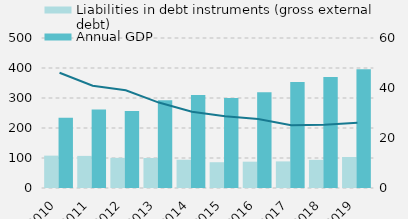
| Category | Liabilities in debt instruments (gross external debt) | Annual GDP |
|---|---|---|
| 2010.0 | 107878.34 | 234368.713 |
| 2011.0 | 106981.494 | 261630.116 |
| 2012.0 | 100468.09 | 257026.318 |
| 2013.0 | 99987.783 | 292792.303 |
| 2014.0 | 94176.047 | 309913.457 |
| 2015.0 | 85917.134 | 300065.029 |
| 2016.0 | 87733.449 | 318997.442 |
| 2017.0 | 88640.748 | 353664.921 |
| 2018.0 | 93797 | 370015.02 |
| 2019.0 | 103427 | 395530.165 |